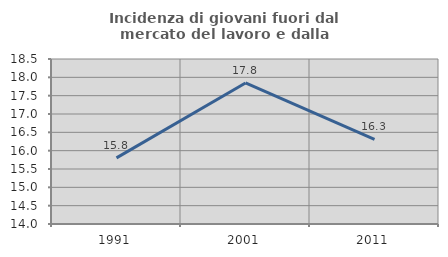
| Category | Incidenza di giovani fuori dal mercato del lavoro e dalla formazione  |
|---|---|
| 1991.0 | 15.803 |
| 2001.0 | 17.846 |
| 2011.0 | 16.311 |